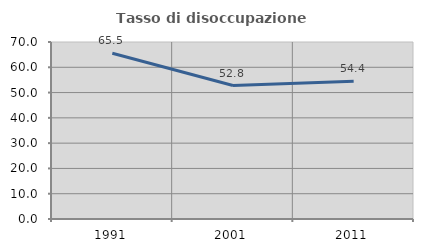
| Category | Tasso di disoccupazione giovanile  |
|---|---|
| 1991.0 | 65.541 |
| 2001.0 | 52.778 |
| 2011.0 | 54.43 |